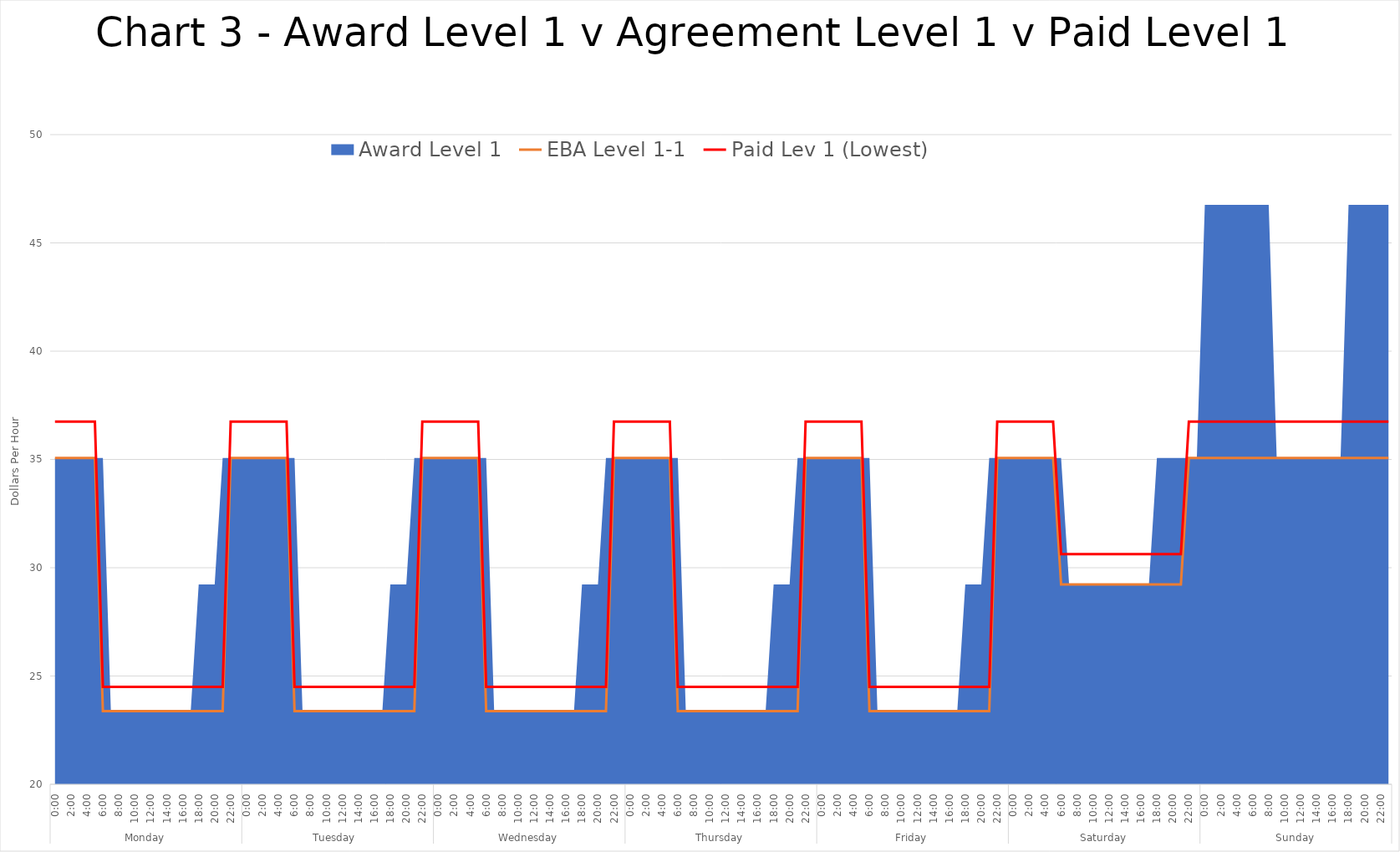
| Category | EBA Level 1-1 | Paid Lev 1 (Lowest) |
|---|---|---|
| 0 | 35.07 | 36.75 |
| 1 | 35.07 | 36.75 |
| 2 | 35.07 | 36.75 |
| 3 | 35.07 | 36.75 |
| 4 | 35.07 | 36.75 |
| 5 | 35.07 | 36.75 |
| 6 | 23.38 | 24.5 |
| 7 | 23.38 | 24.5 |
| 8 | 23.38 | 24.5 |
| 9 | 23.38 | 24.5 |
| 10 | 23.38 | 24.5 |
| 11 | 23.38 | 24.5 |
| 12 | 23.38 | 24.5 |
| 13 | 23.38 | 24.5 |
| 14 | 23.38 | 24.5 |
| 15 | 23.38 | 24.5 |
| 16 | 23.38 | 24.5 |
| 17 | 23.38 | 24.5 |
| 18 | 23.38 | 24.5 |
| 19 | 23.38 | 24.5 |
| 20 | 23.38 | 24.5 |
| 21 | 23.38 | 24.5 |
| 22 | 35.07 | 36.75 |
| 23 | 35.07 | 36.75 |
| 24 | 35.07 | 36.75 |
| 25 | 35.07 | 36.75 |
| 26 | 35.07 | 36.75 |
| 27 | 35.07 | 36.75 |
| 28 | 35.07 | 36.75 |
| 29 | 35.07 | 36.75 |
| 30 | 23.38 | 24.5 |
| 31 | 23.38 | 24.5 |
| 32 | 23.38 | 24.5 |
| 33 | 23.38 | 24.5 |
| 34 | 23.38 | 24.5 |
| 35 | 23.38 | 24.5 |
| 36 | 23.38 | 24.5 |
| 37 | 23.38 | 24.5 |
| 38 | 23.38 | 24.5 |
| 39 | 23.38 | 24.5 |
| 40 | 23.38 | 24.5 |
| 41 | 23.38 | 24.5 |
| 42 | 23.38 | 24.5 |
| 43 | 23.38 | 24.5 |
| 44 | 23.38 | 24.5 |
| 45 | 23.38 | 24.5 |
| 46 | 35.07 | 36.75 |
| 47 | 35.07 | 36.75 |
| 48 | 35.07 | 36.75 |
| 49 | 35.07 | 36.75 |
| 50 | 35.07 | 36.75 |
| 51 | 35.07 | 36.75 |
| 52 | 35.07 | 36.75 |
| 53 | 35.07 | 36.75 |
| 54 | 23.38 | 24.5 |
| 55 | 23.38 | 24.5 |
| 56 | 23.38 | 24.5 |
| 57 | 23.38 | 24.5 |
| 58 | 23.38 | 24.5 |
| 59 | 23.38 | 24.5 |
| 60 | 23.38 | 24.5 |
| 61 | 23.38 | 24.5 |
| 62 | 23.38 | 24.5 |
| 63 | 23.38 | 24.5 |
| 64 | 23.38 | 24.5 |
| 65 | 23.38 | 24.5 |
| 66 | 23.38 | 24.5 |
| 67 | 23.38 | 24.5 |
| 68 | 23.38 | 24.5 |
| 69 | 23.38 | 24.5 |
| 70 | 35.07 | 36.75 |
| 71 | 35.07 | 36.75 |
| 72 | 35.07 | 36.75 |
| 73 | 35.07 | 36.75 |
| 74 | 35.07 | 36.75 |
| 75 | 35.07 | 36.75 |
| 76 | 35.07 | 36.75 |
| 77 | 35.07 | 36.75 |
| 78 | 23.38 | 24.5 |
| 79 | 23.38 | 24.5 |
| 80 | 23.38 | 24.5 |
| 81 | 23.38 | 24.5 |
| 82 | 23.38 | 24.5 |
| 83 | 23.38 | 24.5 |
| 84 | 23.38 | 24.5 |
| 85 | 23.38 | 24.5 |
| 86 | 23.38 | 24.5 |
| 87 | 23.38 | 24.5 |
| 88 | 23.38 | 24.5 |
| 89 | 23.38 | 24.5 |
| 90 | 23.38 | 24.5 |
| 91 | 23.38 | 24.5 |
| 92 | 23.38 | 24.5 |
| 93 | 23.38 | 24.5 |
| 94 | 35.07 | 36.75 |
| 95 | 35.07 | 36.75 |
| 96 | 35.07 | 36.75 |
| 97 | 35.07 | 36.75 |
| 98 | 35.07 | 36.75 |
| 99 | 35.07 | 36.75 |
| 100 | 35.07 | 36.75 |
| 101 | 35.07 | 36.75 |
| 102 | 23.38 | 24.5 |
| 103 | 23.38 | 24.5 |
| 104 | 23.38 | 24.5 |
| 105 | 23.38 | 24.5 |
| 106 | 23.38 | 24.5 |
| 107 | 23.38 | 24.5 |
| 108 | 23.38 | 24.5 |
| 109 | 23.38 | 24.5 |
| 110 | 23.38 | 24.5 |
| 111 | 23.38 | 24.5 |
| 112 | 23.38 | 24.5 |
| 113 | 23.38 | 24.5 |
| 114 | 23.38 | 24.5 |
| 115 | 23.38 | 24.5 |
| 116 | 23.38 | 24.5 |
| 117 | 23.38 | 24.5 |
| 118 | 35.07 | 36.75 |
| 119 | 35.07 | 36.75 |
| 120 | 35.07 | 36.75 |
| 121 | 35.07 | 36.75 |
| 122 | 35.07 | 36.75 |
| 123 | 35.07 | 36.75 |
| 124 | 35.07 | 36.75 |
| 125 | 35.07 | 36.75 |
| 126 | 29.225 | 30.625 |
| 127 | 29.225 | 30.625 |
| 128 | 29.225 | 30.625 |
| 129 | 29.225 | 30.625 |
| 130 | 29.225 | 30.625 |
| 131 | 29.225 | 30.625 |
| 132 | 29.225 | 30.625 |
| 133 | 29.225 | 30.625 |
| 134 | 29.225 | 30.625 |
| 135 | 29.225 | 30.625 |
| 136 | 29.225 | 30.625 |
| 137 | 29.225 | 30.625 |
| 138 | 29.225 | 30.625 |
| 139 | 29.225 | 30.625 |
| 140 | 29.225 | 30.625 |
| 141 | 29.225 | 30.625 |
| 142 | 35.07 | 36.75 |
| 143 | 35.07 | 36.75 |
| 144 | 35.07 | 36.75 |
| 145 | 35.07 | 36.75 |
| 146 | 35.07 | 36.75 |
| 147 | 35.07 | 36.75 |
| 148 | 35.07 | 36.75 |
| 149 | 35.07 | 36.75 |
| 150 | 35.07 | 36.75 |
| 151 | 35.07 | 36.75 |
| 152 | 35.07 | 36.75 |
| 153 | 35.07 | 36.75 |
| 154 | 35.07 | 36.75 |
| 155 | 35.07 | 36.75 |
| 156 | 35.07 | 36.75 |
| 157 | 35.07 | 36.75 |
| 158 | 35.07 | 36.75 |
| 159 | 35.07 | 36.75 |
| 160 | 35.07 | 36.75 |
| 161 | 35.07 | 36.75 |
| 162 | 35.07 | 36.75 |
| 163 | 35.07 | 36.75 |
| 164 | 35.07 | 36.75 |
| 165 | 35.07 | 36.75 |
| 166 | 35.07 | 36.75 |
| 167 | 35.07 | 36.75 |